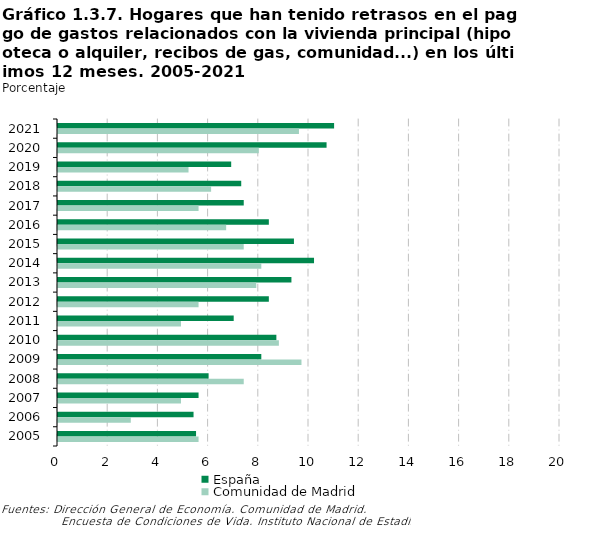
| Category | España | Comunidad de Madrid |
|---|---|---|
| 2021 | 11 | 9.6 |
| 2020 | 10.7 | 8 |
| 2019 | 6.9 | 5.2 |
| 2018 | 7.3 | 6.1 |
| 2017 | 7.4 | 5.6 |
| 2016 | 8.4 | 6.7 |
| 2015 | 9.4 | 7.4 |
| 2014 | 10.2 | 8.1 |
| 2013 | 9.3 | 7.9 |
| 2012 | 8.4 | 5.6 |
| 2011 | 7 | 4.9 |
| 2010 | 8.7 | 8.8 |
| 2009 | 8.1 | 9.7 |
| 2008 | 6 | 7.4 |
| 2007 | 5.6 | 4.9 |
| 2006 | 5.4 | 2.9 |
| 2005 | 5.5 | 5.6 |